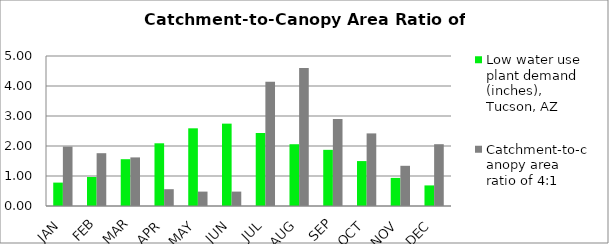
| Category | Low water use plant demand (inches), Tucson, AZ  | Catchment-to-canopy area ratio of 4:1  |
|---|---|---|
| JAN | 0.78 | 1.98 |
| FEB | 0.967 | 1.76 |
| MAR | 1.56 | 1.62 |
| APR | 2.09 | 0.56 |
| MAY | 2.59 | 0.48 |
| JUN | 2.746 | 0.48 |
| JUL | 2.434 | 4.14 |
| AUG | 2.059 | 4.6 |
| SEP | 1.872 | 2.9 |
| OCT | 1.498 | 2.42 |
| NOV | 0.936 | 1.34 |
| DEC | 0.686 | 2.06 |